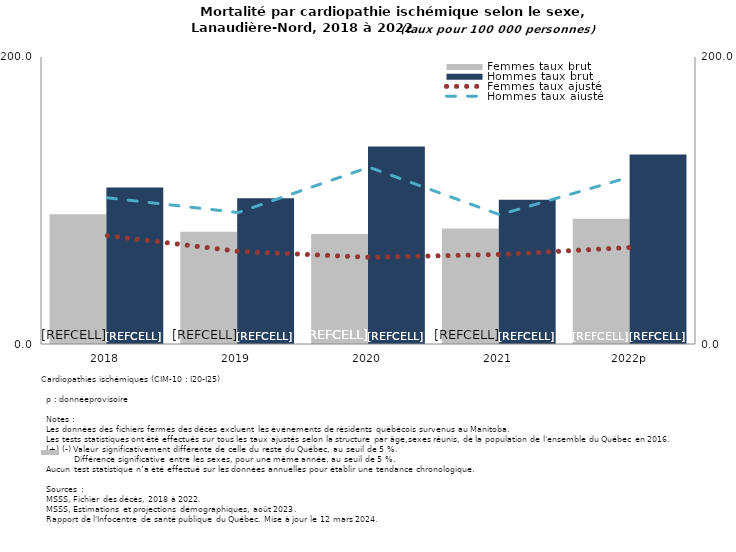
| Category | Femmes taux brut | Hommes taux brut |
|---|---|---|
| 2018 | 90.5 | 109.1 |
| 2019 | 78.2 | 101.5 |
| 2020 | 76.6 | 137.6 |
| 2021 | 80.5 | 100.6 |
| 2022p | 87.3 | 132.1 |